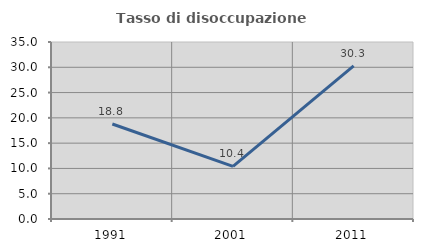
| Category | Tasso di disoccupazione giovanile  |
|---|---|
| 1991.0 | 18.785 |
| 2001.0 | 10.405 |
| 2011.0 | 30.29 |